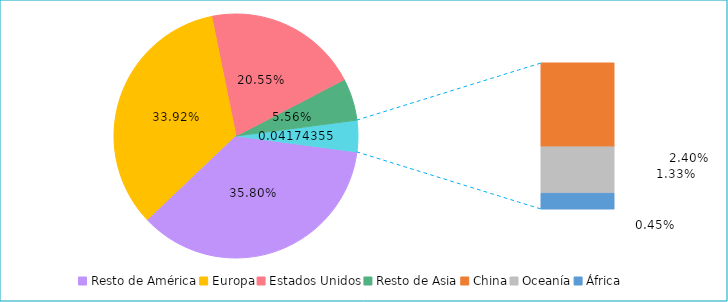
| Category | Series 0 |
|---|---|
| Resto de América | 0.358 |
| Europa | 0.339 |
| Estados Unidos | 0.205 |
| Resto de Asia | 0.056 |
| China | 0.024 |
| Oceanía | 0.013 |
| África | 0.004 |